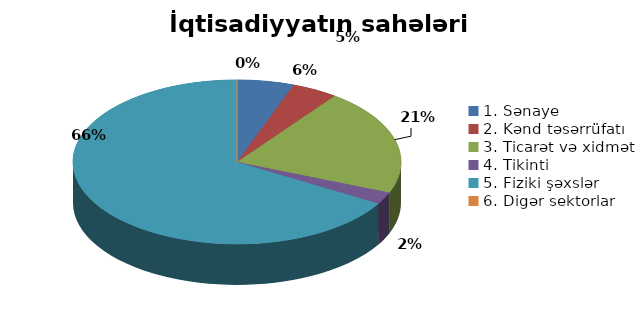
| Category | Series 0 |
|---|---|
| 1. Sənaye | 0.056 |
| 2. Kənd təsərrüfatı | 0.045 |
| 3. Ticarət və xidmət | 0.21 |
| 4. Tikinti | 0.024 |
| 5. Fiziki şəxslər | 0.665 |
| 6. Digər sektorlar | 0 |